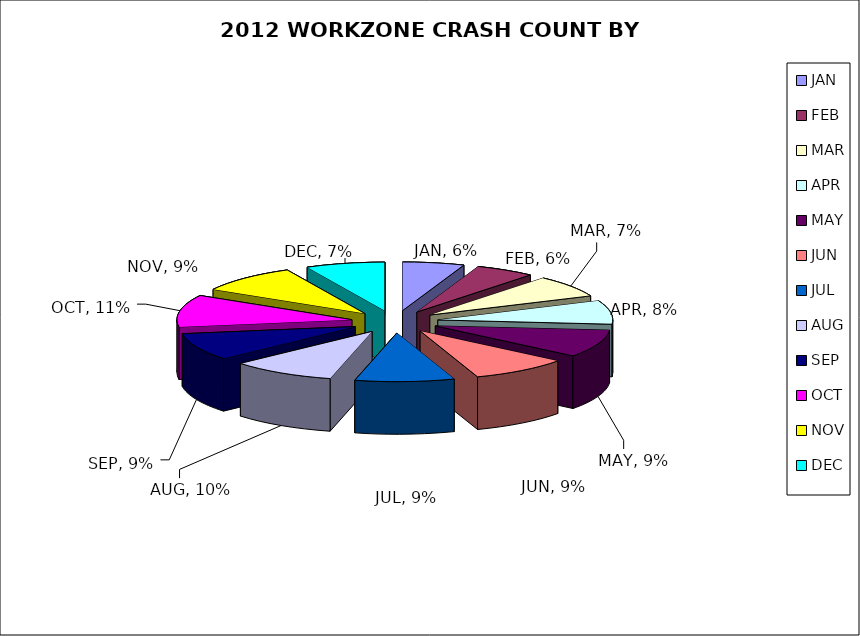
| Category | Month |
|---|---|
| JAN | 0.057 |
| FEB | 0.055 |
| MAR | 0.073 |
| APR | 0.078 |
| MAY | 0.092 |
| JUN | 0.091 |
| JUL | 0.092 |
| AUG | 0.097 |
| SEP | 0.091 |
| OCT | 0.106 |
| NOV | 0.094 |
| DEC | 0.073 |